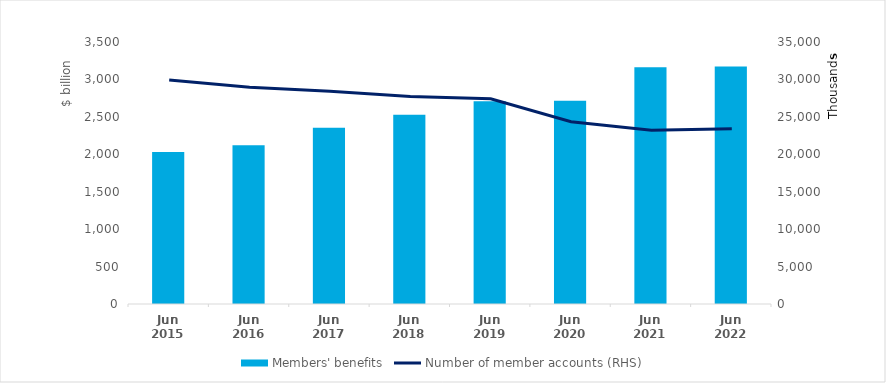
| Category | Members' benefits |
|---|---|
| 0 | 2029.3 |
| 1 | 2121.5 |
| 2 | 2355.6 |
| 3 | 2528.8 |
| 4 | 2707.2 |
| 5 | 2715.2 |
| 6 | 3163.6 |
| 7 | 3171.9 |